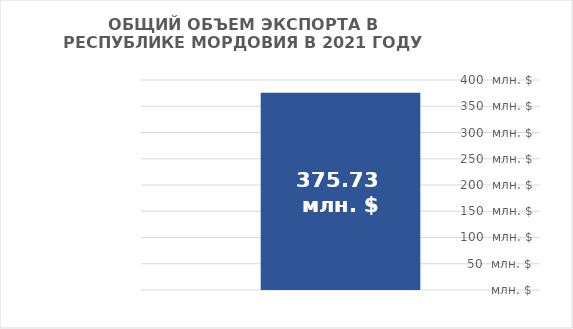
| Category | Итог |
|---|---|
| Итог | 375725.71 |